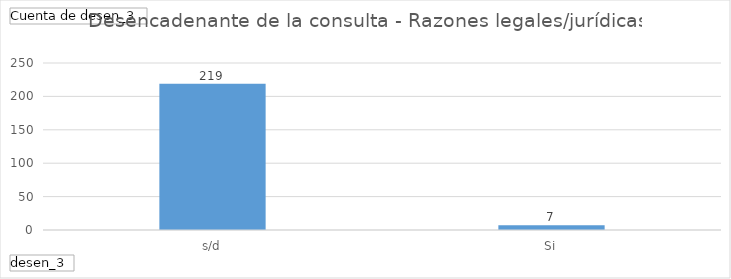
| Category | Total |
|---|---|
| s/d | 219 |
| Si | 7 |